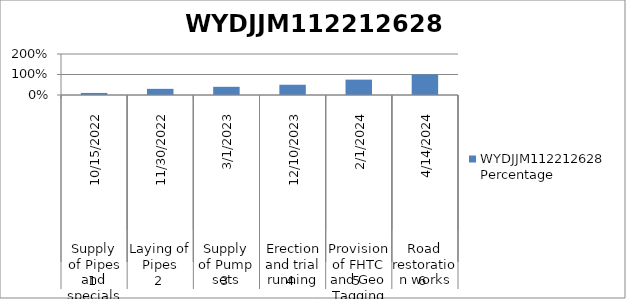
| Category | WYDJJM112212628 Percentage |
|---|---|
| 0 | 0.1 |
| 1 | 0.3 |
| 2 | 0.4 |
| 3 | 0.5 |
| 4 | 0.75 |
| 5 | 1 |